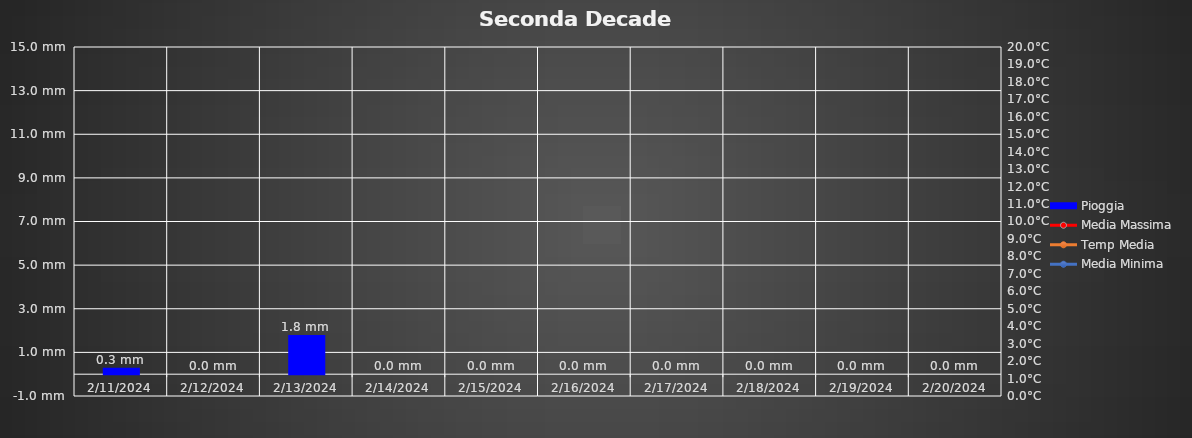
| Category | Pioggia |
|---|---|
| 2/11/24 | 0.3 |
| 2/12/24 | 0 |
| 2/13/24 | 1900-01-01 19:12:00 |
| 2/14/24 | 0 |
| 2/15/24 | 0 |
| 2/16/24 | 0 |
| 2/17/24 | 0 |
| 2/18/24 | 0 |
| 2/19/24 | 0 |
| 2/20/24 | 0 |